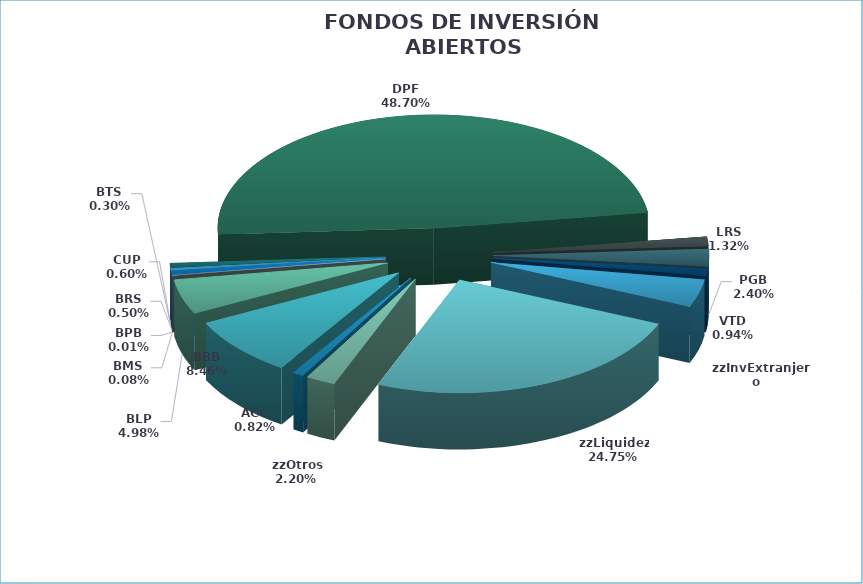
| Category | Series 0 |
|---|---|
| ACC | 10317841.705 |
| BBB | 106769902.024 |
| BLP | 62907196.854 |
| BMS | 964688.776 |
| BPB | 118610.2 |
| BRS | 6259994.82 |
| BTS | 3758005.793 |
| CUP | 7547252.295 |
| DPF | 614632729.117 |
| LRS | 16623242.405 |
| PGB | 30344192.462 |
| VTD | 11825571.813 |
| zzInvExtranjero | 49819798.849 |
| zzLiquidez | 312334219.116 |
| zzOtros | 27743146.702 |